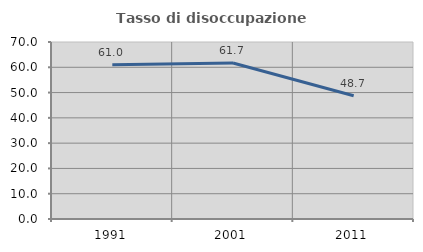
| Category | Tasso di disoccupazione giovanile  |
|---|---|
| 1991.0 | 61.007 |
| 2001.0 | 61.69 |
| 2011.0 | 48.729 |